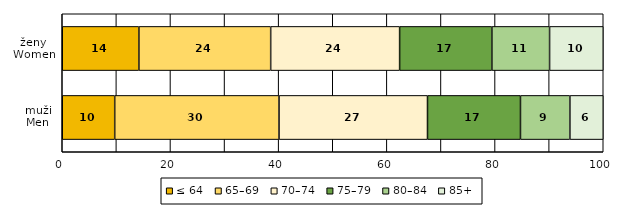
| Category | ≤ 64 | 65–69 | 70–74 | 75–79 | 80–84 | 85+ |
|---|---|---|---|---|---|---|
| muži
Men | 9.697 | 30.371 | 27.443 | 17.189 | 9.136 | 6.164 |
| ženy
Women | 14.169 | 24.358 | 23.831 | 17.057 | 10.665 | 9.919 |